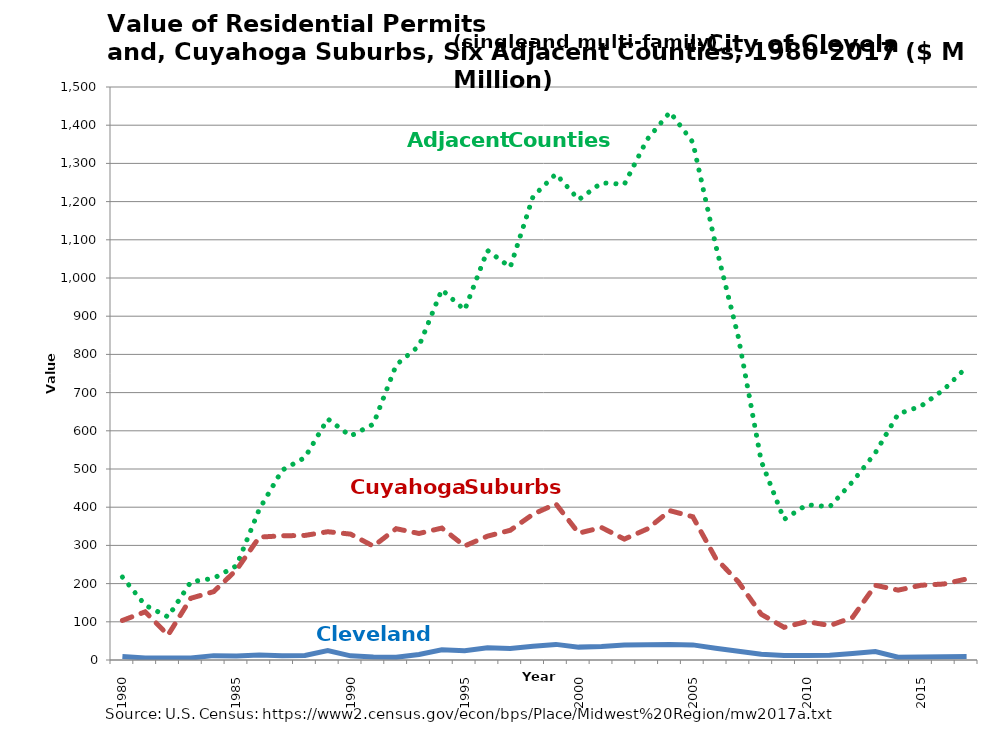
| Category | Adjacent Counties | Cuyahoga Suburbs | Cleveland |
|---|---|---|---|
| 1980.0 | 217.128 | 103.504 | 9.169 |
| nan | 143.373 | 126.182 | 5.232 |
| nan | 112.809 | 65.249 | 5.256 |
| nan | 204.614 | 161.643 | 5.247 |
| nan | 213.925 | 178.941 | 11.434 |
| 1985.0 | 246.566 | 235.84 | 10.607 |
| nan | 394.677 | 321.644 | 12.974 |
| nan | 496.823 | 325.123 | 10.92 |
| nan | 530.007 | 326.154 | 11.833 |
| nan | 631.079 | 335.775 | 24.807 |
| 1990.0 | 586.269 | 329.556 | 10.881 |
| nan | 617.445 | 297.94 | 7.575 |
| nan | 772.388 | 343.749 | 6.969 |
| nan | 822.202 | 331.221 | 14.592 |
| nan | 969.418 | 345.398 | 26.992 |
| 1995.0 | 916.206 | 298.463 | 24.258 |
| nan | 1072.065 | 324.187 | 32.109 |
| nan | 1028.29 | 339.595 | 30.389 |
| nan | 1213.674 | 381.784 | 35.767 |
| nan | 1272.415 | 408.503 | 40.87 |
| 2000.0 | 1205.068 | 332.027 | 33.711 |
| nan | 1249.126 | 346.861 | 35.279 |
| nan | 1245.262 | 316.455 | 39.326 |
| nan | 1362.817 | 342.961 | 40.029 |
| nan | 1434.432 | 390.821 | 40.685 |
| 2005.0 | 1355.604 | 375.014 | 39.547 |
| nan | 1086.572 | 266.543 | 30.977 |
| nan | 844.298 | 204.362 | 22.682 |
| nan | 520.427 | 119.691 | 14.908 |
| nan | 368.021 | 85.531 | 11.641 |
| 2010.0 | 406.465 | 100.831 | 12.017 |
| nan | 401.05 | 90.018 | 12.471 |
| nan | 466.546 | 111.585 | 17.275 |
| nan | 542.226 | 195.593 | 22.027 |
| nan | 644.112 | 182.876 | 7.35 |
| 2015.0 | 664.504 | 195.62 | 7.907 |
| nan | 707.692 | 198.927 | 8.654 |
| nan | 766.352 | 212.131 | 9.004 |